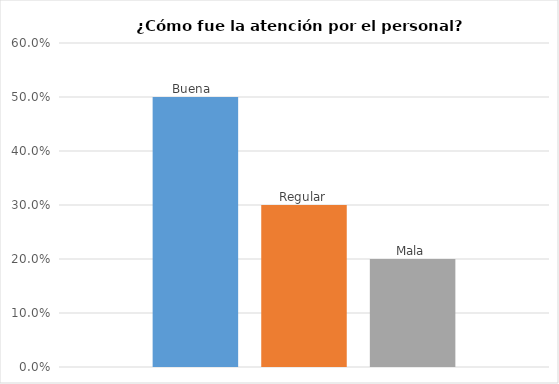
| Category | Buena  | Regular | Mala |
|---|---|---|---|
| 0 | 0.5 | 0.3 | 0.2 |